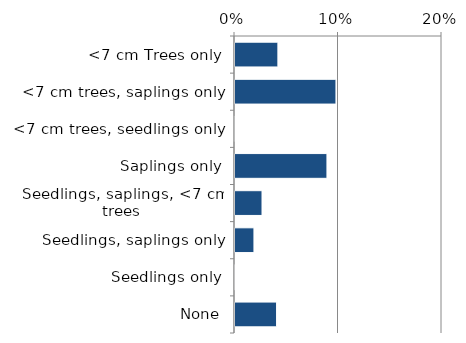
| Category | Native |
|---|---|
| None | 0.041 |
| Seedlings only | 0 |
| Seedlings, saplings only | 0.019 |
| Seedlings, saplings, <7 cm trees | 0.027 |
| Saplings only | 0.09 |
| <7 cm trees, seedlings only | 0 |
| <7 cm trees, saplings only | 0.099 |
| <7 cm Trees only | 0.042 |